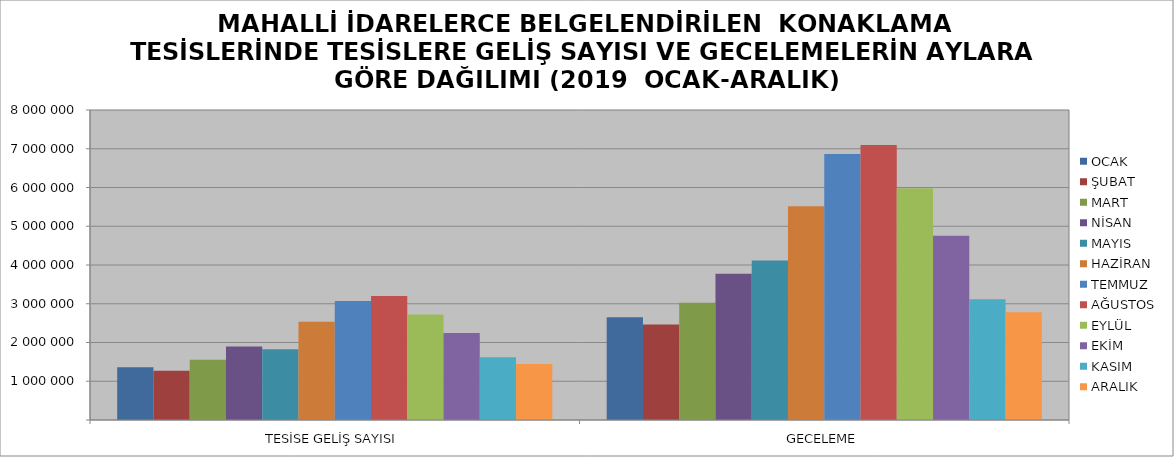
| Category | OCAK | ŞUBAT | MART | NİSAN | MAYIS | HAZİRAN | TEMMUZ | AĞUSTOS | EYLÜL | EKİM | KASIM | ARALIK |
|---|---|---|---|---|---|---|---|---|---|---|---|---|
| TESİSE GELİŞ SAYISI | 1363187 | 1273727 | 1552518 | 1898202 | 1826154 | 2537491 | 3073499 | 3201724 | 2721047 | 2242115 | 1617176 | 1445545 |
| GECELEME | 2649437 | 2462023 | 3024704 | 3772615 | 4117532 | 5513568 | 6866550 | 7097153 | 5980815 | 4758060 | 3114074 | 2781548 |